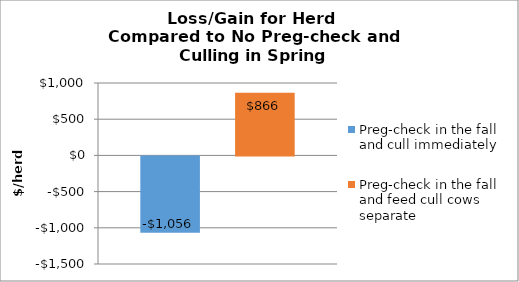
| Category | Preg-check in the fall and cull immediately | Preg-check in the fall and feed cull cows separate |
|---|---|---|
| 0 | -1056.014 | 865.68 |